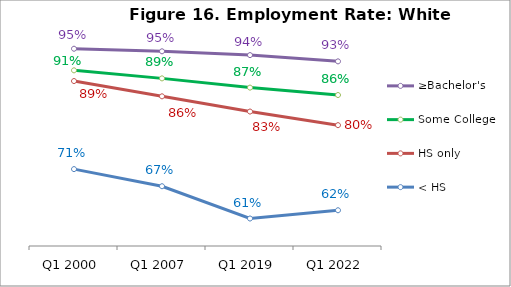
| Category | ≥Bachelor's | Some College | HS only | < HS |
|---|---|---|---|---|
| Q1 2000 | 0.954 | 0.909 | 0.887 | 0.707 |
| Q1 2007 | 0.948 | 0.893 | 0.856 | 0.672 |
| Q1 2019 | 0.94 | 0.874 | 0.825 | 0.606 |
| Q1 2022 | 0.928 | 0.859 | 0.797 | 0.623 |